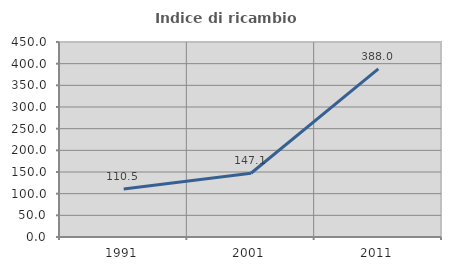
| Category | Indice di ricambio occupazionale  |
|---|---|
| 1991.0 | 110.526 |
| 2001.0 | 147.059 |
| 2011.0 | 388 |